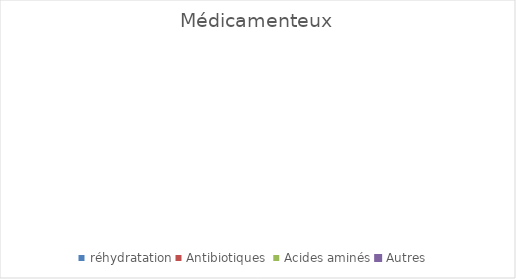
| Category | Médicamenteux |
|---|---|
| réhydratation | 0 |
| Antibiotiques  | 0 |
| Acides aminés | 0 |
| Autres | 0 |